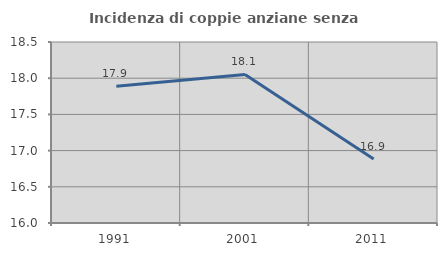
| Category | Incidenza di coppie anziane senza figli  |
|---|---|
| 1991.0 | 17.889 |
| 2001.0 | 18.052 |
| 2011.0 | 16.883 |